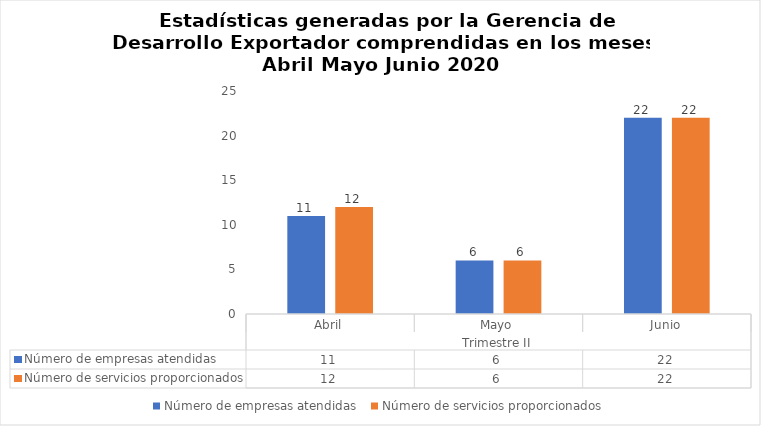
| Category | Número de empresas atendidas  | Número de servicios proporcionados |
|---|---|---|
| 0 | 11 | 12 |
| 1 | 6 | 6 |
| 2 | 22 | 22 |